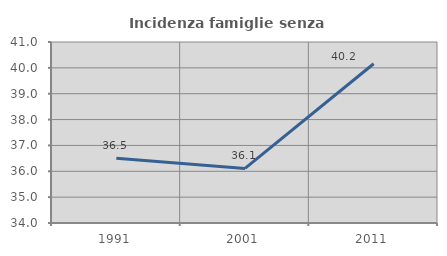
| Category | Incidenza famiglie senza nuclei |
|---|---|
| 1991.0 | 36.508 |
| 2001.0 | 36.111 |
| 2011.0 | 40.157 |